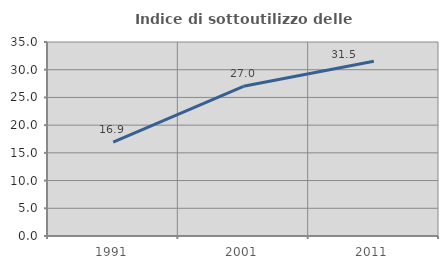
| Category | Indice di sottoutilizzo delle abitazioni  |
|---|---|
| 1991.0 | 16.949 |
| 2001.0 | 27.012 |
| 2011.0 | 31.538 |